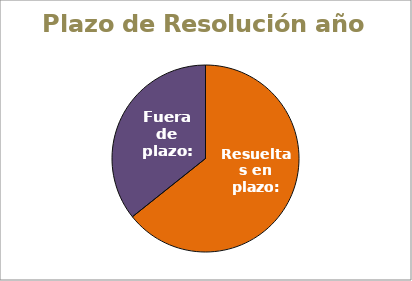
| Category | Series 0 |
|---|---|
| Resueltas en plazo: | 9 |
| Fuera de plazo: | 5 |